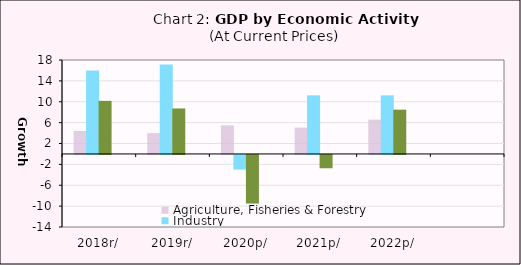
| Category | Agriculture, Fisheries & Forestry  | Industry | Services | Population Estimate in Million Peoples |
|---|---|---|---|---|
| 2018r/ | 4.417 | 15.988 | 10.172 |  |
| 2019r/ | 3.986 | 17.146 | 8.716 |  |
| 2020p/ | 5.475 | -2.808 | -9.315 |  |
| 2021p/ | 5.052 | 11.226 | -2.551 |  |
| 2022p/ | 6.564 | 11.226 | 8.482 |  |